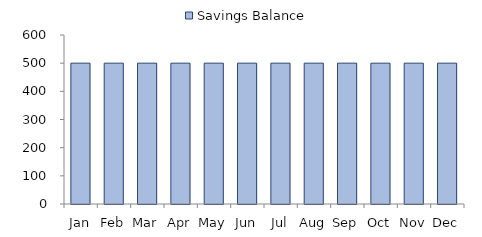
| Category | Savings Balance |
|---|---|
| Jan | 500 |
| Feb | 500 |
| Mar | 500 |
| Apr | 500 |
| May | 500 |
| Jun | 500 |
| Jul | 500 |
| Aug | 500 |
| Sep | 500 |
| Oct | 500 |
| Nov | 500 |
| Dec | 500 |